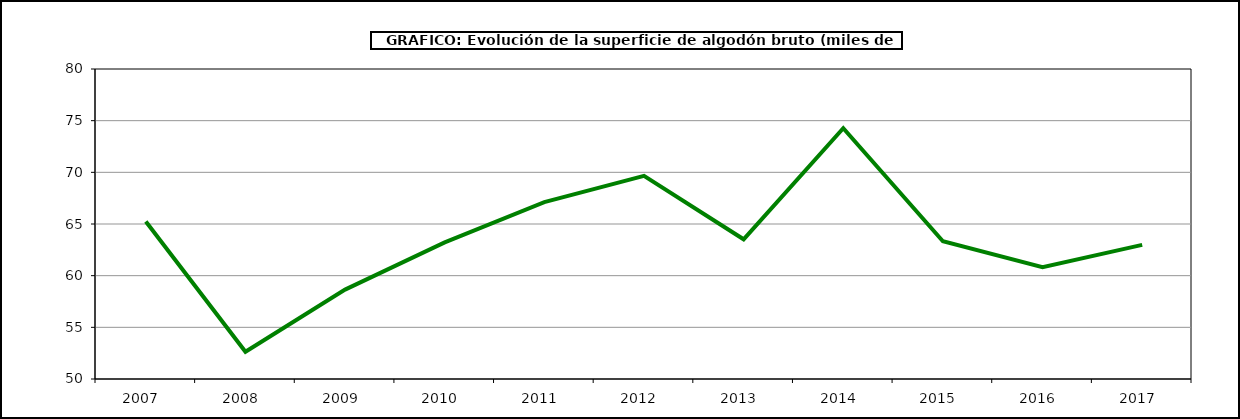
| Category | Superficie |
|---|---|
| 2007.0 | 65.238 |
| 2008.0 | 52.639 |
| 2009.0 | 58.649 |
| 2010.0 | 63.217 |
| 2011.0 | 67.118 |
| 2012.0 | 69.662 |
| 2013.0 | 63.52 |
| 2014.0 | 74.265 |
| 2015.0 | 63.326 |
| 2016.0 | 60.814 |
| 2017.0 | 62.982 |